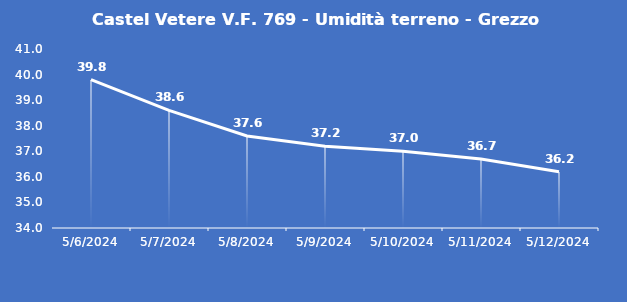
| Category | Castel Vetere V.F. 769 - Umidità terreno - Grezzo (%VWC) |
|---|---|
| 5/6/24 | 39.8 |
| 5/7/24 | 38.6 |
| 5/8/24 | 37.6 |
| 5/9/24 | 37.2 |
| 5/10/24 | 37 |
| 5/11/24 | 36.7 |
| 5/12/24 | 36.2 |